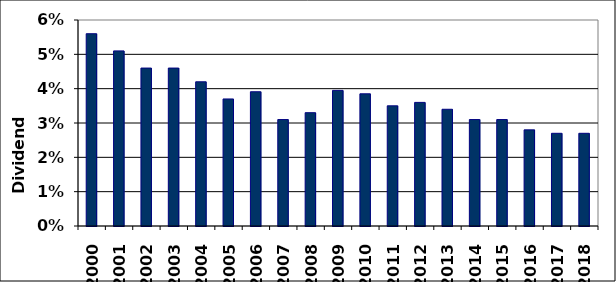
| Category | Series 0 |
|---|---|
| 2000.0 | 0.056 |
| 2001.0 | 0.051 |
| 2002.0 | 0.046 |
| 2003.0 | 0.046 |
| 2004.0 | 0.042 |
| 2005.0 | 0.037 |
| 2006.0 | 0.039 |
| 2007.0 | 0.031 |
| 2008.0 | 0.033 |
| 2009.0 | 0.04 |
| 2010.0 | 0.038 |
| 2011.0 | 0.035 |
| 2012.0 | 0.036 |
| 2013.0 | 0.034 |
| 2014.0 | 0.031 |
| 2015.0 | 0.031 |
| 2016.0 | 0.028 |
| 2017.0 | 0.027 |
| 2018.0 | 0.027 |